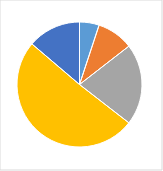
| Category | Series 0 |
|---|---|
| 0 | 0.051 |
| 1 | 0.094 |
| 2 | 0.21 |
| 3 | 0.507 |
| 4 | 0.138 |